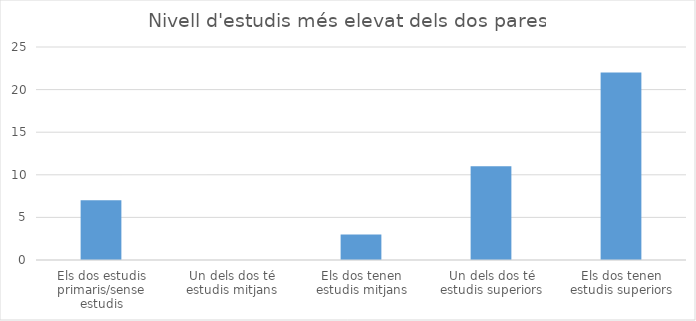
| Category | Series 0 |
|---|---|
| Els dos estudis primaris/sense estudis | 7 |
| Un dels dos té estudis mitjans | 0 |
| Els dos tenen estudis mitjans | 3 |
| Un dels dos té estudis superiors | 11 |
| Els dos tenen estudis superiors | 22 |